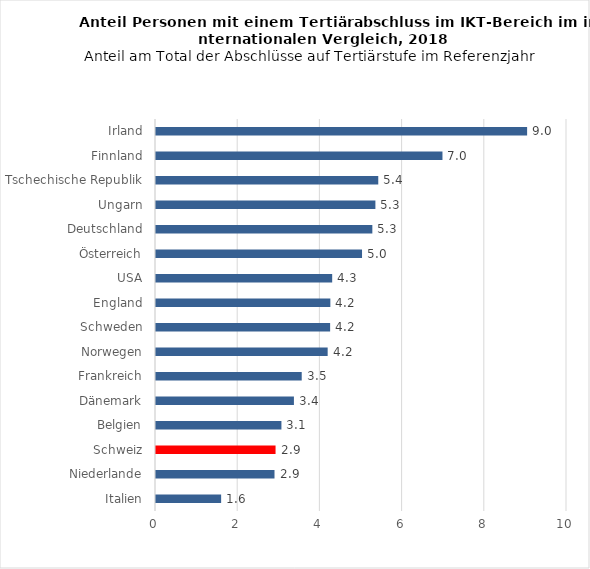
| Category | 2018 |
|---|---|
| Italien | 1.585 |
| Niederlande | 2.883 |
| Schweiz | 2.909 |
| Belgien | 3.052 |
| Dänemark | 3.356 |
| Frankreich | 3.546 |
| Norwegen | 4.177 |
| Schweden | 4.237 |
| England | 4.242 |
| USA | 4.287 |
| Österreich | 5.013 |
| Deutschland | 5.264 |
| Ungarn | 5.338 |
| Tschechische Republik | 5.408 |
| Finnland | 6.97 |
| Irland | 9.03 |